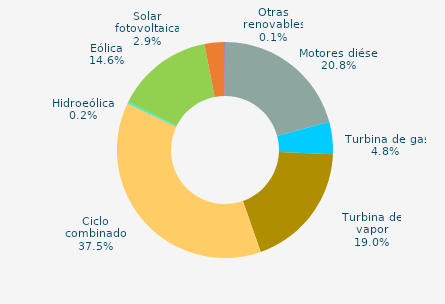
| Category | Series 0 |
|---|---|
| Motores diésel | 20.796 |
| Turbina de gas | 4.825 |
| Turbina de vapor | 19.008 |
| Ciclo combinado | 37.482 |
| Cogeneración | 0 |
| Hidráulica | 0.044 |
| Hidroeólica | 0.216 |
| Eólica | 14.569 |
| Solar fotovoltaica | 2.944 |
| Otras renovables | 0.116 |